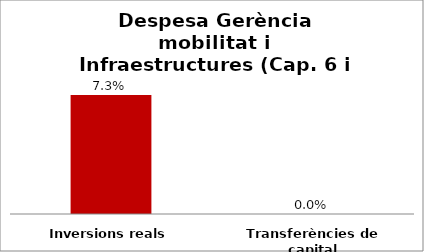
| Category | Series 0 |
|---|---|
| Inversions reals | 0.073 |
| Transferències de capital | 0 |